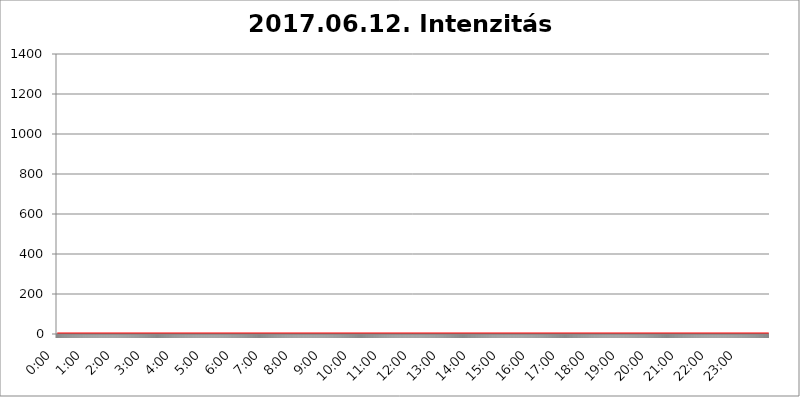
| Category | 2017.06.12. Intenzitás [W/m^2] |
|---|---|
| 0.0 | 0 |
| 0.0006944444444444445 | 0 |
| 0.001388888888888889 | 0 |
| 0.0020833333333333333 | 0 |
| 0.002777777777777778 | 0 |
| 0.003472222222222222 | 0 |
| 0.004166666666666667 | 0 |
| 0.004861111111111111 | 0 |
| 0.005555555555555556 | 0 |
| 0.0062499999999999995 | 0 |
| 0.006944444444444444 | 0 |
| 0.007638888888888889 | 0 |
| 0.008333333333333333 | 0 |
| 0.009027777777777779 | 0 |
| 0.009722222222222222 | 0 |
| 0.010416666666666666 | 0 |
| 0.011111111111111112 | 0 |
| 0.011805555555555555 | 0 |
| 0.012499999999999999 | 0 |
| 0.013194444444444444 | 0 |
| 0.013888888888888888 | 0 |
| 0.014583333333333332 | 0 |
| 0.015277777777777777 | 0 |
| 0.015972222222222224 | 0 |
| 0.016666666666666666 | 0 |
| 0.017361111111111112 | 0 |
| 0.018055555555555557 | 0 |
| 0.01875 | 0 |
| 0.019444444444444445 | 0 |
| 0.02013888888888889 | 0 |
| 0.020833333333333332 | 0 |
| 0.02152777777777778 | 0 |
| 0.022222222222222223 | 0 |
| 0.02291666666666667 | 0 |
| 0.02361111111111111 | 0 |
| 0.024305555555555556 | 0 |
| 0.024999999999999998 | 0 |
| 0.025694444444444447 | 0 |
| 0.02638888888888889 | 0 |
| 0.027083333333333334 | 0 |
| 0.027777777777777776 | 0 |
| 0.02847222222222222 | 0 |
| 0.029166666666666664 | 0 |
| 0.029861111111111113 | 0 |
| 0.030555555555555555 | 0 |
| 0.03125 | 0 |
| 0.03194444444444445 | 0 |
| 0.03263888888888889 | 0 |
| 0.03333333333333333 | 0 |
| 0.034027777777777775 | 0 |
| 0.034722222222222224 | 0 |
| 0.035416666666666666 | 0 |
| 0.036111111111111115 | 0 |
| 0.03680555555555556 | 0 |
| 0.0375 | 0 |
| 0.03819444444444444 | 0 |
| 0.03888888888888889 | 0 |
| 0.03958333333333333 | 0 |
| 0.04027777777777778 | 0 |
| 0.04097222222222222 | 0 |
| 0.041666666666666664 | 0 |
| 0.042361111111111106 | 0 |
| 0.04305555555555556 | 0 |
| 0.043750000000000004 | 0 |
| 0.044444444444444446 | 0 |
| 0.04513888888888889 | 0 |
| 0.04583333333333334 | 0 |
| 0.04652777777777778 | 0 |
| 0.04722222222222222 | 0 |
| 0.04791666666666666 | 0 |
| 0.04861111111111111 | 0 |
| 0.049305555555555554 | 0 |
| 0.049999999999999996 | 0 |
| 0.05069444444444445 | 0 |
| 0.051388888888888894 | 0 |
| 0.052083333333333336 | 0 |
| 0.05277777777777778 | 0 |
| 0.05347222222222222 | 0 |
| 0.05416666666666667 | 0 |
| 0.05486111111111111 | 0 |
| 0.05555555555555555 | 0 |
| 0.05625 | 0 |
| 0.05694444444444444 | 0 |
| 0.057638888888888885 | 0 |
| 0.05833333333333333 | 0 |
| 0.05902777777777778 | 0 |
| 0.059722222222222225 | 0 |
| 0.06041666666666667 | 0 |
| 0.061111111111111116 | 0 |
| 0.06180555555555556 | 0 |
| 0.0625 | 0 |
| 0.06319444444444444 | 0 |
| 0.06388888888888888 | 0 |
| 0.06458333333333334 | 0 |
| 0.06527777777777778 | 0 |
| 0.06597222222222222 | 0 |
| 0.06666666666666667 | 0 |
| 0.06736111111111111 | 0 |
| 0.06805555555555555 | 0 |
| 0.06874999999999999 | 0 |
| 0.06944444444444443 | 0 |
| 0.07013888888888889 | 0 |
| 0.07083333333333333 | 0 |
| 0.07152777777777779 | 0 |
| 0.07222222222222223 | 0 |
| 0.07291666666666667 | 0 |
| 0.07361111111111111 | 0 |
| 0.07430555555555556 | 0 |
| 0.075 | 0 |
| 0.07569444444444444 | 0 |
| 0.0763888888888889 | 0 |
| 0.07708333333333334 | 0 |
| 0.07777777777777778 | 0 |
| 0.07847222222222222 | 0 |
| 0.07916666666666666 | 0 |
| 0.0798611111111111 | 0 |
| 0.08055555555555556 | 0 |
| 0.08125 | 0 |
| 0.08194444444444444 | 0 |
| 0.08263888888888889 | 0 |
| 0.08333333333333333 | 0 |
| 0.08402777777777777 | 0 |
| 0.08472222222222221 | 0 |
| 0.08541666666666665 | 0 |
| 0.08611111111111112 | 0 |
| 0.08680555555555557 | 0 |
| 0.08750000000000001 | 0 |
| 0.08819444444444445 | 0 |
| 0.08888888888888889 | 0 |
| 0.08958333333333333 | 0 |
| 0.09027777777777778 | 0 |
| 0.09097222222222222 | 0 |
| 0.09166666666666667 | 0 |
| 0.09236111111111112 | 0 |
| 0.09305555555555556 | 0 |
| 0.09375 | 0 |
| 0.09444444444444444 | 0 |
| 0.09513888888888888 | 0 |
| 0.09583333333333333 | 0 |
| 0.09652777777777777 | 0 |
| 0.09722222222222222 | 0 |
| 0.09791666666666667 | 0 |
| 0.09861111111111111 | 0 |
| 0.09930555555555555 | 0 |
| 0.09999999999999999 | 0 |
| 0.10069444444444443 | 0 |
| 0.1013888888888889 | 0 |
| 0.10208333333333335 | 0 |
| 0.10277777777777779 | 0 |
| 0.10347222222222223 | 0 |
| 0.10416666666666667 | 0 |
| 0.10486111111111111 | 0 |
| 0.10555555555555556 | 0 |
| 0.10625 | 0 |
| 0.10694444444444444 | 0 |
| 0.1076388888888889 | 0 |
| 0.10833333333333334 | 0 |
| 0.10902777777777778 | 0 |
| 0.10972222222222222 | 0 |
| 0.1111111111111111 | 0 |
| 0.11180555555555556 | 0 |
| 0.11180555555555556 | 0 |
| 0.1125 | 0 |
| 0.11319444444444444 | 0 |
| 0.11388888888888889 | 0 |
| 0.11458333333333333 | 0 |
| 0.11527777777777777 | 0 |
| 0.11597222222222221 | 0 |
| 0.11666666666666665 | 0 |
| 0.1173611111111111 | 0 |
| 0.11805555555555557 | 0 |
| 0.11944444444444445 | 0 |
| 0.12013888888888889 | 0 |
| 0.12083333333333333 | 0 |
| 0.12152777777777778 | 0 |
| 0.12222222222222223 | 0 |
| 0.12291666666666667 | 0 |
| 0.12291666666666667 | 0 |
| 0.12361111111111112 | 0 |
| 0.12430555555555556 | 0 |
| 0.125 | 0 |
| 0.12569444444444444 | 0 |
| 0.12638888888888888 | 0 |
| 0.12708333333333333 | 0 |
| 0.16875 | 0 |
| 0.12847222222222224 | 0 |
| 0.12916666666666668 | 0 |
| 0.12986111111111112 | 0 |
| 0.13055555555555556 | 0 |
| 0.13125 | 0 |
| 0.13194444444444445 | 0 |
| 0.1326388888888889 | 0 |
| 0.13333333333333333 | 0 |
| 0.13402777777777777 | 0 |
| 0.13402777777777777 | 0 |
| 0.13472222222222222 | 0 |
| 0.13541666666666666 | 0 |
| 0.1361111111111111 | 0 |
| 0.13749999999999998 | 0 |
| 0.13819444444444443 | 0 |
| 0.1388888888888889 | 0 |
| 0.13958333333333334 | 0 |
| 0.14027777777777778 | 0 |
| 0.14097222222222222 | 0 |
| 0.14166666666666666 | 0 |
| 0.1423611111111111 | 0 |
| 0.14305555555555557 | 0 |
| 0.14375000000000002 | 0 |
| 0.14444444444444446 | 0 |
| 0.1451388888888889 | 0 |
| 0.1451388888888889 | 0 |
| 0.14652777777777778 | 0 |
| 0.14722222222222223 | 0 |
| 0.14791666666666667 | 0 |
| 0.1486111111111111 | 0 |
| 0.14930555555555555 | 0 |
| 0.15 | 0 |
| 0.15069444444444444 | 0 |
| 0.15138888888888888 | 0 |
| 0.15208333333333332 | 0 |
| 0.15277777777777776 | 0 |
| 0.15347222222222223 | 0 |
| 0.15416666666666667 | 0 |
| 0.15486111111111112 | 0 |
| 0.15555555555555556 | 0 |
| 0.15625 | 0 |
| 0.15694444444444444 | 0 |
| 0.15763888888888888 | 0 |
| 0.15833333333333333 | 0 |
| 0.15902777777777777 | 0 |
| 0.15972222222222224 | 0 |
| 0.16041666666666668 | 0 |
| 0.16111111111111112 | 0 |
| 0.16180555555555556 | 0 |
| 0.1625 | 0 |
| 0.16319444444444445 | 0 |
| 0.1638888888888889 | 0 |
| 0.16458333333333333 | 0 |
| 0.16527777777777777 | 0 |
| 0.16597222222222222 | 0 |
| 0.16666666666666666 | 0 |
| 0.1673611111111111 | 0 |
| 0.16805555555555554 | 0 |
| 0.16874999999999998 | 0 |
| 0.16944444444444443 | 0 |
| 0.17013888888888887 | 0 |
| 0.1708333333333333 | 0 |
| 0.17152777777777775 | 0 |
| 0.17222222222222225 | 0 |
| 0.1729166666666667 | 0 |
| 0.17361111111111113 | 0 |
| 0.17430555555555557 | 0 |
| 0.17500000000000002 | 0 |
| 0.17569444444444446 | 0 |
| 0.1763888888888889 | 0 |
| 0.17708333333333334 | 0 |
| 0.17777777777777778 | 0 |
| 0.17847222222222223 | 0 |
| 0.17916666666666667 | 0 |
| 0.1798611111111111 | 0 |
| 0.18055555555555555 | 0 |
| 0.18125 | 0 |
| 0.18194444444444444 | 0 |
| 0.1826388888888889 | 0 |
| 0.18333333333333335 | 0 |
| 0.1840277777777778 | 0 |
| 0.18472222222222223 | 0 |
| 0.18541666666666667 | 0 |
| 0.18611111111111112 | 0 |
| 0.18680555555555556 | 0 |
| 0.1875 | 0 |
| 0.18819444444444444 | 0 |
| 0.18888888888888888 | 0 |
| 0.18958333333333333 | 0 |
| 0.19027777777777777 | 0 |
| 0.1909722222222222 | 0 |
| 0.19166666666666665 | 0 |
| 0.19236111111111112 | 0 |
| 0.19305555555555554 | 0 |
| 0.19375 | 0 |
| 0.19444444444444445 | 0 |
| 0.1951388888888889 | 0 |
| 0.19583333333333333 | 0 |
| 0.19652777777777777 | 0 |
| 0.19722222222222222 | 0 |
| 0.19791666666666666 | 0 |
| 0.1986111111111111 | 0 |
| 0.19930555555555554 | 0 |
| 0.19999999999999998 | 0 |
| 0.20069444444444443 | 0 |
| 0.20138888888888887 | 0 |
| 0.2020833333333333 | 0 |
| 0.2027777777777778 | 0 |
| 0.2034722222222222 | 0 |
| 0.2041666666666667 | 0 |
| 0.20486111111111113 | 0 |
| 0.20555555555555557 | 0 |
| 0.20625000000000002 | 0 |
| 0.20694444444444446 | 0 |
| 0.2076388888888889 | 0 |
| 0.20833333333333334 | 0 |
| 0.20902777777777778 | 0 |
| 0.20972222222222223 | 0 |
| 0.21041666666666667 | 0 |
| 0.2111111111111111 | 0 |
| 0.21180555555555555 | 0 |
| 0.2125 | 0 |
| 0.21319444444444444 | 0 |
| 0.2138888888888889 | 0 |
| 0.21458333333333335 | 0 |
| 0.2152777777777778 | 0 |
| 0.21597222222222223 | 0 |
| 0.21666666666666667 | 0 |
| 0.21736111111111112 | 0 |
| 0.21805555555555556 | 0 |
| 0.21875 | 0 |
| 0.21944444444444444 | 0 |
| 0.22013888888888888 | 0 |
| 0.22083333333333333 | 0 |
| 0.22152777777777777 | 0 |
| 0.2222222222222222 | 0 |
| 0.22291666666666665 | 0 |
| 0.2236111111111111 | 0 |
| 0.22430555555555556 | 0 |
| 0.225 | 0 |
| 0.22569444444444445 | 0 |
| 0.2263888888888889 | 0 |
| 0.22708333333333333 | 0 |
| 0.22777777777777777 | 0 |
| 0.22847222222222222 | 0 |
| 0.22916666666666666 | 0 |
| 0.2298611111111111 | 0 |
| 0.23055555555555554 | 0 |
| 0.23124999999999998 | 0 |
| 0.23194444444444443 | 0 |
| 0.23263888888888887 | 0 |
| 0.2333333333333333 | 0 |
| 0.2340277777777778 | 0 |
| 0.2347222222222222 | 0 |
| 0.2354166666666667 | 0 |
| 0.23611111111111113 | 0 |
| 0.23680555555555557 | 0 |
| 0.23750000000000002 | 0 |
| 0.23819444444444446 | 0 |
| 0.2388888888888889 | 0 |
| 0.23958333333333334 | 0 |
| 0.24027777777777778 | 0 |
| 0.24097222222222223 | 0 |
| 0.24166666666666667 | 0 |
| 0.2423611111111111 | 0 |
| 0.24305555555555555 | 0 |
| 0.24375 | 0 |
| 0.24444444444444446 | 0 |
| 0.24513888888888888 | 0 |
| 0.24583333333333335 | 0 |
| 0.2465277777777778 | 0 |
| 0.24722222222222223 | 0 |
| 0.24791666666666667 | 0 |
| 0.24861111111111112 | 0 |
| 0.24930555555555556 | 0 |
| 0.25 | 0 |
| 0.25069444444444444 | 0 |
| 0.2513888888888889 | 0 |
| 0.2520833333333333 | 0 |
| 0.25277777777777777 | 0 |
| 0.2534722222222222 | 0 |
| 0.25416666666666665 | 0 |
| 0.2548611111111111 | 0 |
| 0.2555555555555556 | 0 |
| 0.25625000000000003 | 0 |
| 0.2569444444444445 | 0 |
| 0.2576388888888889 | 0 |
| 0.25833333333333336 | 0 |
| 0.2590277777777778 | 0 |
| 0.25972222222222224 | 0 |
| 0.2604166666666667 | 0 |
| 0.2611111111111111 | 0 |
| 0.26180555555555557 | 0 |
| 0.2625 | 0 |
| 0.26319444444444445 | 0 |
| 0.2638888888888889 | 0 |
| 0.26458333333333334 | 0 |
| 0.2652777777777778 | 0 |
| 0.2659722222222222 | 0 |
| 0.26666666666666666 | 0 |
| 0.2673611111111111 | 0 |
| 0.26805555555555555 | 0 |
| 0.26875 | 0 |
| 0.26944444444444443 | 0 |
| 0.2701388888888889 | 0 |
| 0.2708333333333333 | 0 |
| 0.27152777777777776 | 0 |
| 0.2722222222222222 | 0 |
| 0.27291666666666664 | 0 |
| 0.2736111111111111 | 0 |
| 0.2743055555555555 | 0 |
| 0.27499999999999997 | 0 |
| 0.27569444444444446 | 0 |
| 0.27638888888888885 | 0 |
| 0.27708333333333335 | 0 |
| 0.2777777777777778 | 0 |
| 0.27847222222222223 | 0 |
| 0.2791666666666667 | 0 |
| 0.2798611111111111 | 0 |
| 0.28055555555555556 | 0 |
| 0.28125 | 0 |
| 0.28194444444444444 | 0 |
| 0.2826388888888889 | 0 |
| 0.2833333333333333 | 0 |
| 0.28402777777777777 | 0 |
| 0.2847222222222222 | 0 |
| 0.28541666666666665 | 0 |
| 0.28611111111111115 | 0 |
| 0.28680555555555554 | 0 |
| 0.28750000000000003 | 0 |
| 0.2881944444444445 | 0 |
| 0.2888888888888889 | 0 |
| 0.28958333333333336 | 0 |
| 0.2902777777777778 | 0 |
| 0.29097222222222224 | 0 |
| 0.2916666666666667 | 0 |
| 0.2923611111111111 | 0 |
| 0.29305555555555557 | 0 |
| 0.29375 | 0 |
| 0.29444444444444445 | 0 |
| 0.2951388888888889 | 0 |
| 0.29583333333333334 | 0 |
| 0.2965277777777778 | 0 |
| 0.2972222222222222 | 0 |
| 0.29791666666666666 | 0 |
| 0.2986111111111111 | 0 |
| 0.29930555555555555 | 0 |
| 0.3 | 0 |
| 0.30069444444444443 | 0 |
| 0.3013888888888889 | 0 |
| 0.3020833333333333 | 0 |
| 0.30277777777777776 | 0 |
| 0.3034722222222222 | 0 |
| 0.30416666666666664 | 0 |
| 0.3048611111111111 | 0 |
| 0.3055555555555555 | 0 |
| 0.30624999999999997 | 0 |
| 0.3069444444444444 | 0 |
| 0.3076388888888889 | 0 |
| 0.30833333333333335 | 0 |
| 0.3090277777777778 | 0 |
| 0.30972222222222223 | 0 |
| 0.3104166666666667 | 0 |
| 0.3111111111111111 | 0 |
| 0.31180555555555556 | 0 |
| 0.3125 | 0 |
| 0.31319444444444444 | 0 |
| 0.3138888888888889 | 0 |
| 0.3145833333333333 | 0 |
| 0.31527777777777777 | 0 |
| 0.3159722222222222 | 0 |
| 0.31666666666666665 | 0 |
| 0.31736111111111115 | 0 |
| 0.31805555555555554 | 0 |
| 0.31875000000000003 | 0 |
| 0.3194444444444445 | 0 |
| 0.3201388888888889 | 0 |
| 0.32083333333333336 | 0 |
| 0.3215277777777778 | 0 |
| 0.32222222222222224 | 0 |
| 0.3229166666666667 | 0 |
| 0.3236111111111111 | 0 |
| 0.32430555555555557 | 0 |
| 0.325 | 0 |
| 0.32569444444444445 | 0 |
| 0.3263888888888889 | 0 |
| 0.32708333333333334 | 0 |
| 0.3277777777777778 | 0 |
| 0.3284722222222222 | 0 |
| 0.32916666666666666 | 0 |
| 0.3298611111111111 | 0 |
| 0.33055555555555555 | 0 |
| 0.33125 | 0 |
| 0.33194444444444443 | 0 |
| 0.3326388888888889 | 0 |
| 0.3333333333333333 | 0 |
| 0.3340277777777778 | 0 |
| 0.3347222222222222 | 0 |
| 0.3354166666666667 | 0 |
| 0.3361111111111111 | 0 |
| 0.3368055555555556 | 0 |
| 0.33749999999999997 | 0 |
| 0.33819444444444446 | 0 |
| 0.33888888888888885 | 0 |
| 0.33958333333333335 | 0 |
| 0.34027777777777773 | 0 |
| 0.34097222222222223 | 0 |
| 0.3416666666666666 | 0 |
| 0.3423611111111111 | 0 |
| 0.3430555555555555 | 0 |
| 0.34375 | 0 |
| 0.3444444444444445 | 0 |
| 0.3451388888888889 | 0 |
| 0.3458333333333334 | 0 |
| 0.34652777777777777 | 0 |
| 0.34722222222222227 | 0 |
| 0.34791666666666665 | 0 |
| 0.34861111111111115 | 0 |
| 0.34930555555555554 | 0 |
| 0.35000000000000003 | 0 |
| 0.3506944444444444 | 0 |
| 0.3513888888888889 | 0 |
| 0.3520833333333333 | 0 |
| 0.3527777777777778 | 0 |
| 0.3534722222222222 | 0 |
| 0.3541666666666667 | 0 |
| 0.3548611111111111 | 0 |
| 0.35555555555555557 | 0 |
| 0.35625 | 0 |
| 0.35694444444444445 | 0 |
| 0.3576388888888889 | 0 |
| 0.35833333333333334 | 0 |
| 0.3590277777777778 | 0 |
| 0.3597222222222222 | 0 |
| 0.36041666666666666 | 0 |
| 0.3611111111111111 | 0 |
| 0.36180555555555555 | 0 |
| 0.3625 | 0 |
| 0.36319444444444443 | 0 |
| 0.3638888888888889 | 0 |
| 0.3645833333333333 | 0 |
| 0.3652777777777778 | 0 |
| 0.3659722222222222 | 0 |
| 0.3666666666666667 | 0 |
| 0.3673611111111111 | 0 |
| 0.3680555555555556 | 0 |
| 0.36874999999999997 | 0 |
| 0.36944444444444446 | 0 |
| 0.37013888888888885 | 0 |
| 0.37083333333333335 | 0 |
| 0.37152777777777773 | 0 |
| 0.37222222222222223 | 0 |
| 0.3729166666666666 | 0 |
| 0.3736111111111111 | 0 |
| 0.3743055555555555 | 0 |
| 0.375 | 0 |
| 0.3756944444444445 | 0 |
| 0.3763888888888889 | 0 |
| 0.3770833333333334 | 0 |
| 0.37777777777777777 | 0 |
| 0.37847222222222227 | 0 |
| 0.37916666666666665 | 0 |
| 0.37986111111111115 | 0 |
| 0.38055555555555554 | 0 |
| 0.38125000000000003 | 0 |
| 0.3819444444444444 | 0 |
| 0.3826388888888889 | 0 |
| 0.3833333333333333 | 0 |
| 0.3840277777777778 | 0 |
| 0.3847222222222222 | 0 |
| 0.3854166666666667 | 0 |
| 0.3861111111111111 | 0 |
| 0.38680555555555557 | 0 |
| 0.3875 | 0 |
| 0.38819444444444445 | 0 |
| 0.3888888888888889 | 0 |
| 0.38958333333333334 | 0 |
| 0.3902777777777778 | 0 |
| 0.3909722222222222 | 0 |
| 0.39166666666666666 | 0 |
| 0.3923611111111111 | 0 |
| 0.39305555555555555 | 0 |
| 0.39375 | 0 |
| 0.39444444444444443 | 0 |
| 0.3951388888888889 | 0 |
| 0.3958333333333333 | 0 |
| 0.3965277777777778 | 0 |
| 0.3972222222222222 | 0 |
| 0.3979166666666667 | 0 |
| 0.3986111111111111 | 0 |
| 0.3993055555555556 | 0 |
| 0.39999999999999997 | 0 |
| 0.40069444444444446 | 0 |
| 0.40138888888888885 | 0 |
| 0.40208333333333335 | 0 |
| 0.40277777777777773 | 0 |
| 0.40347222222222223 | 0 |
| 0.4041666666666666 | 0 |
| 0.4048611111111111 | 0 |
| 0.4055555555555555 | 0 |
| 0.40625 | 0 |
| 0.4069444444444445 | 0 |
| 0.4076388888888889 | 0 |
| 0.4083333333333334 | 0 |
| 0.40902777777777777 | 0 |
| 0.40972222222222227 | 0 |
| 0.41041666666666665 | 0 |
| 0.41111111111111115 | 0 |
| 0.41180555555555554 | 0 |
| 0.41250000000000003 | 0 |
| 0.4131944444444444 | 0 |
| 0.4138888888888889 | 0 |
| 0.4145833333333333 | 0 |
| 0.4152777777777778 | 0 |
| 0.4159722222222222 | 0 |
| 0.4166666666666667 | 0 |
| 0.4173611111111111 | 0 |
| 0.41805555555555557 | 0 |
| 0.41875 | 0 |
| 0.41944444444444445 | 0 |
| 0.4201388888888889 | 0 |
| 0.42083333333333334 | 0 |
| 0.4215277777777778 | 0 |
| 0.4222222222222222 | 0 |
| 0.42291666666666666 | 0 |
| 0.4236111111111111 | 0 |
| 0.42430555555555555 | 0 |
| 0.425 | 0 |
| 0.42569444444444443 | 0 |
| 0.4263888888888889 | 0 |
| 0.4270833333333333 | 0 |
| 0.4277777777777778 | 0 |
| 0.4284722222222222 | 0 |
| 0.4291666666666667 | 0 |
| 0.4298611111111111 | 0 |
| 0.4305555555555556 | 0 |
| 0.43124999999999997 | 0 |
| 0.43194444444444446 | 0 |
| 0.43263888888888885 | 0 |
| 0.43333333333333335 | 0 |
| 0.43402777777777773 | 0 |
| 0.43472222222222223 | 0 |
| 0.4354166666666666 | 0 |
| 0.4361111111111111 | 0 |
| 0.4368055555555555 | 0 |
| 0.4375 | 0 |
| 0.4381944444444445 | 0 |
| 0.4388888888888889 | 0 |
| 0.4395833333333334 | 0 |
| 0.44027777777777777 | 0 |
| 0.44097222222222227 | 0 |
| 0.44166666666666665 | 0 |
| 0.44236111111111115 | 0 |
| 0.44305555555555554 | 0 |
| 0.44375000000000003 | 0 |
| 0.4444444444444444 | 0 |
| 0.4451388888888889 | 0 |
| 0.4458333333333333 | 0 |
| 0.4465277777777778 | 0 |
| 0.4472222222222222 | 0 |
| 0.4479166666666667 | 0 |
| 0.4486111111111111 | 0 |
| 0.44930555555555557 | 0 |
| 0.45 | 0 |
| 0.45069444444444445 | 0 |
| 0.4513888888888889 | 0 |
| 0.45208333333333334 | 0 |
| 0.4527777777777778 | 0 |
| 0.4534722222222222 | 0 |
| 0.45416666666666666 | 0 |
| 0.4548611111111111 | 0 |
| 0.45555555555555555 | 0 |
| 0.45625 | 0 |
| 0.45694444444444443 | 0 |
| 0.4576388888888889 | 0 |
| 0.4583333333333333 | 0 |
| 0.4590277777777778 | 0 |
| 0.4597222222222222 | 0 |
| 0.4604166666666667 | 0 |
| 0.4611111111111111 | 0 |
| 0.4618055555555556 | 0 |
| 0.46249999999999997 | 0 |
| 0.46319444444444446 | 0 |
| 0.46388888888888885 | 0 |
| 0.46458333333333335 | 0 |
| 0.46527777777777773 | 0 |
| 0.46597222222222223 | 0 |
| 0.4666666666666666 | 0 |
| 0.4673611111111111 | 0 |
| 0.4680555555555555 | 0 |
| 0.46875 | 0 |
| 0.4694444444444445 | 0 |
| 0.4701388888888889 | 0 |
| 0.4708333333333334 | 0 |
| 0.47152777777777777 | 0 |
| 0.47222222222222227 | 0 |
| 0.47291666666666665 | 0 |
| 0.47361111111111115 | 0 |
| 0.47430555555555554 | 0 |
| 0.47500000000000003 | 0 |
| 0.4756944444444444 | 0 |
| 0.4763888888888889 | 0 |
| 0.4770833333333333 | 0 |
| 0.4777777777777778 | 0 |
| 0.4784722222222222 | 0 |
| 0.4791666666666667 | 0 |
| 0.4798611111111111 | 0 |
| 0.48055555555555557 | 0 |
| 0.48125 | 0 |
| 0.48194444444444445 | 0 |
| 0.4826388888888889 | 0 |
| 0.48333333333333334 | 0 |
| 0.4840277777777778 | 0 |
| 0.4847222222222222 | 0 |
| 0.48541666666666666 | 0 |
| 0.4861111111111111 | 0 |
| 0.48680555555555555 | 0 |
| 0.4875 | 0 |
| 0.48819444444444443 | 0 |
| 0.4888888888888889 | 0 |
| 0.4895833333333333 | 0 |
| 0.4902777777777778 | 0 |
| 0.4909722222222222 | 0 |
| 0.4916666666666667 | 0 |
| 0.4923611111111111 | 0 |
| 0.4930555555555556 | 0 |
| 0.49374999999999997 | 0 |
| 0.49444444444444446 | 0 |
| 0.49513888888888885 | 0 |
| 0.49583333333333335 | 0 |
| 0.49652777777777773 | 0 |
| 0.49722222222222223 | 0 |
| 0.4979166666666666 | 0 |
| 0.4986111111111111 | 0 |
| 0.4993055555555555 | 0 |
| 0.5 | 0 |
| 0.5006944444444444 | 0 |
| 0.5013888888888889 | 0 |
| 0.5020833333333333 | 0 |
| 0.5027777777777778 | 0 |
| 0.5034722222222222 | 0 |
| 0.5041666666666667 | 0 |
| 0.5048611111111111 | 0 |
| 0.5055555555555555 | 0 |
| 0.50625 | 0 |
| 0.5069444444444444 | 0 |
| 0.5076388888888889 | 0 |
| 0.5083333333333333 | 0 |
| 0.5090277777777777 | 0 |
| 0.5097222222222222 | 0 |
| 0.5104166666666666 | 0 |
| 0.5111111111111112 | 0 |
| 0.5118055555555555 | 0 |
| 0.5125000000000001 | 0 |
| 0.5131944444444444 | 0 |
| 0.513888888888889 | 0 |
| 0.5145833333333333 | 0 |
| 0.5152777777777778 | 0 |
| 0.5159722222222222 | 0 |
| 0.5166666666666667 | 0 |
| 0.517361111111111 | 0 |
| 0.5180555555555556 | 0 |
| 0.5187499999999999 | 0 |
| 0.5194444444444445 | 0 |
| 0.5201388888888888 | 0 |
| 0.5208333333333334 | 0 |
| 0.5215277777777778 | 0 |
| 0.5222222222222223 | 0 |
| 0.5229166666666667 | 0 |
| 0.5236111111111111 | 0 |
| 0.5243055555555556 | 0 |
| 0.525 | 0 |
| 0.5256944444444445 | 0 |
| 0.5263888888888889 | 0 |
| 0.5270833333333333 | 0 |
| 0.5277777777777778 | 0 |
| 0.5284722222222222 | 0 |
| 0.5291666666666667 | 0 |
| 0.5298611111111111 | 0 |
| 0.5305555555555556 | 0 |
| 0.53125 | 0 |
| 0.5319444444444444 | 0 |
| 0.5326388888888889 | 0 |
| 0.5333333333333333 | 0 |
| 0.5340277777777778 | 0 |
| 0.5347222222222222 | 0 |
| 0.5354166666666667 | 0 |
| 0.5361111111111111 | 0 |
| 0.5368055555555555 | 0 |
| 0.5375 | 0 |
| 0.5381944444444444 | 0 |
| 0.5388888888888889 | 0 |
| 0.5395833333333333 | 0 |
| 0.5402777777777777 | 0 |
| 0.5409722222222222 | 0 |
| 0.5416666666666666 | 0 |
| 0.5423611111111112 | 0 |
| 0.5430555555555555 | 0 |
| 0.5437500000000001 | 0 |
| 0.5444444444444444 | 0 |
| 0.545138888888889 | 0 |
| 0.5458333333333333 | 0 |
| 0.5465277777777778 | 0 |
| 0.5472222222222222 | 0 |
| 0.5479166666666667 | 0 |
| 0.548611111111111 | 0 |
| 0.5493055555555556 | 0 |
| 0.5499999999999999 | 0 |
| 0.5506944444444445 | 0 |
| 0.5513888888888888 | 0 |
| 0.5520833333333334 | 0 |
| 0.5527777777777778 | 0 |
| 0.5534722222222223 | 0 |
| 0.5541666666666667 | 0 |
| 0.5548611111111111 | 0 |
| 0.5555555555555556 | 0 |
| 0.55625 | 0 |
| 0.5569444444444445 | 0 |
| 0.5576388888888889 | 0 |
| 0.5583333333333333 | 0 |
| 0.5590277777777778 | 0 |
| 0.5597222222222222 | 0 |
| 0.5604166666666667 | 0 |
| 0.5611111111111111 | 0 |
| 0.5618055555555556 | 0 |
| 0.5625 | 0 |
| 0.5631944444444444 | 0 |
| 0.5638888888888889 | 0 |
| 0.5645833333333333 | 0 |
| 0.5652777777777778 | 0 |
| 0.5659722222222222 | 0 |
| 0.5666666666666667 | 0 |
| 0.5673611111111111 | 0 |
| 0.5680555555555555 | 0 |
| 0.56875 | 0 |
| 0.5694444444444444 | 0 |
| 0.5701388888888889 | 0 |
| 0.5708333333333333 | 0 |
| 0.5715277777777777 | 0 |
| 0.5722222222222222 | 0 |
| 0.5729166666666666 | 0 |
| 0.5736111111111112 | 0 |
| 0.5743055555555555 | 0 |
| 0.5750000000000001 | 0 |
| 0.5756944444444444 | 0 |
| 0.576388888888889 | 0 |
| 0.5770833333333333 | 0 |
| 0.5777777777777778 | 0 |
| 0.5784722222222222 | 0 |
| 0.5791666666666667 | 0 |
| 0.579861111111111 | 0 |
| 0.5805555555555556 | 0 |
| 0.5812499999999999 | 0 |
| 0.5819444444444445 | 0 |
| 0.5826388888888888 | 0 |
| 0.5833333333333334 | 0 |
| 0.5840277777777778 | 0 |
| 0.5847222222222223 | 0 |
| 0.5854166666666667 | 0 |
| 0.5861111111111111 | 0 |
| 0.5868055555555556 | 0 |
| 0.5875 | 0 |
| 0.5881944444444445 | 0 |
| 0.5888888888888889 | 0 |
| 0.5895833333333333 | 0 |
| 0.5902777777777778 | 0 |
| 0.5909722222222222 | 0 |
| 0.5916666666666667 | 0 |
| 0.5923611111111111 | 0 |
| 0.5930555555555556 | 0 |
| 0.59375 | 0 |
| 0.5944444444444444 | 0 |
| 0.5951388888888889 | 0 |
| 0.5958333333333333 | 0 |
| 0.5965277777777778 | 0 |
| 0.5972222222222222 | 0 |
| 0.5979166666666667 | 0 |
| 0.5986111111111111 | 0 |
| 0.5993055555555555 | 0 |
| 0.6 | 0 |
| 0.6006944444444444 | 0 |
| 0.6013888888888889 | 0 |
| 0.6020833333333333 | 0 |
| 0.6027777777777777 | 0 |
| 0.6034722222222222 | 0 |
| 0.6041666666666666 | 0 |
| 0.6048611111111112 | 0 |
| 0.6055555555555555 | 0 |
| 0.6062500000000001 | 0 |
| 0.6069444444444444 | 0 |
| 0.607638888888889 | 0 |
| 0.6083333333333333 | 0 |
| 0.6090277777777778 | 0 |
| 0.6097222222222222 | 0 |
| 0.6104166666666667 | 0 |
| 0.611111111111111 | 0 |
| 0.6118055555555556 | 0 |
| 0.6124999999999999 | 0 |
| 0.6131944444444445 | 0 |
| 0.6138888888888888 | 0 |
| 0.6145833333333334 | 0 |
| 0.6152777777777778 | 0 |
| 0.6159722222222223 | 0 |
| 0.6166666666666667 | 0 |
| 0.6173611111111111 | 0 |
| 0.6180555555555556 | 0 |
| 0.61875 | 0 |
| 0.6194444444444445 | 0 |
| 0.6201388888888889 | 0 |
| 0.6208333333333333 | 0 |
| 0.6215277777777778 | 0 |
| 0.6222222222222222 | 0 |
| 0.6229166666666667 | 0 |
| 0.6236111111111111 | 0 |
| 0.6243055555555556 | 0 |
| 0.625 | 0 |
| 0.6256944444444444 | 0 |
| 0.6263888888888889 | 0 |
| 0.6270833333333333 | 0 |
| 0.6277777777777778 | 0 |
| 0.6284722222222222 | 0 |
| 0.6291666666666667 | 0 |
| 0.6298611111111111 | 0 |
| 0.6305555555555555 | 0 |
| 0.63125 | 0 |
| 0.6319444444444444 | 0 |
| 0.6326388888888889 | 0 |
| 0.6333333333333333 | 0 |
| 0.6340277777777777 | 0 |
| 0.6347222222222222 | 0 |
| 0.6354166666666666 | 0 |
| 0.6361111111111112 | 0 |
| 0.6368055555555555 | 0 |
| 0.6375000000000001 | 0 |
| 0.6381944444444444 | 0 |
| 0.638888888888889 | 0 |
| 0.6395833333333333 | 0 |
| 0.6402777777777778 | 0 |
| 0.6409722222222222 | 0 |
| 0.6416666666666667 | 0 |
| 0.642361111111111 | 0 |
| 0.6430555555555556 | 0 |
| 0.6437499999999999 | 0 |
| 0.6444444444444445 | 0 |
| 0.6451388888888888 | 0 |
| 0.6458333333333334 | 0 |
| 0.6465277777777778 | 0 |
| 0.6472222222222223 | 0 |
| 0.6479166666666667 | 0 |
| 0.6486111111111111 | 0 |
| 0.6493055555555556 | 0 |
| 0.65 | 0 |
| 0.6506944444444445 | 0 |
| 0.6513888888888889 | 0 |
| 0.6520833333333333 | 0 |
| 0.6527777777777778 | 0 |
| 0.6534722222222222 | 0 |
| 0.6541666666666667 | 0 |
| 0.6548611111111111 | 0 |
| 0.6555555555555556 | 0 |
| 0.65625 | 0 |
| 0.6569444444444444 | 0 |
| 0.6576388888888889 | 0 |
| 0.6583333333333333 | 0 |
| 0.6590277777777778 | 0 |
| 0.6597222222222222 | 0 |
| 0.6604166666666667 | 0 |
| 0.6611111111111111 | 0 |
| 0.6618055555555555 | 0 |
| 0.6625 | 0 |
| 0.6631944444444444 | 0 |
| 0.6638888888888889 | 0 |
| 0.6645833333333333 | 0 |
| 0.6652777777777777 | 0 |
| 0.6659722222222222 | 0 |
| 0.6666666666666666 | 0 |
| 0.6673611111111111 | 0 |
| 0.6680555555555556 | 0 |
| 0.6687500000000001 | 0 |
| 0.6694444444444444 | 0 |
| 0.6701388888888888 | 0 |
| 0.6708333333333334 | 0 |
| 0.6715277777777778 | 0 |
| 0.6722222222222222 | 0 |
| 0.6729166666666666 | 0 |
| 0.6736111111111112 | 0 |
| 0.6743055555555556 | 0 |
| 0.6749999999999999 | 0 |
| 0.6756944444444444 | 0 |
| 0.6763888888888889 | 0 |
| 0.6770833333333334 | 0 |
| 0.6777777777777777 | 0 |
| 0.6784722222222223 | 0 |
| 0.6791666666666667 | 0 |
| 0.6798611111111111 | 0 |
| 0.6805555555555555 | 0 |
| 0.68125 | 0 |
| 0.6819444444444445 | 0 |
| 0.6826388888888889 | 0 |
| 0.6833333333333332 | 0 |
| 0.6840277777777778 | 0 |
| 0.6847222222222222 | 0 |
| 0.6854166666666667 | 0 |
| 0.686111111111111 | 0 |
| 0.6868055555555556 | 0 |
| 0.6875 | 0 |
| 0.6881944444444444 | 0 |
| 0.688888888888889 | 0 |
| 0.6895833333333333 | 0 |
| 0.6902777777777778 | 0 |
| 0.6909722222222222 | 0 |
| 0.6916666666666668 | 0 |
| 0.6923611111111111 | 0 |
| 0.6930555555555555 | 0 |
| 0.69375 | 0 |
| 0.6944444444444445 | 0 |
| 0.6951388888888889 | 0 |
| 0.6958333333333333 | 0 |
| 0.6965277777777777 | 0 |
| 0.6972222222222223 | 0 |
| 0.6979166666666666 | 0 |
| 0.6986111111111111 | 0 |
| 0.6993055555555556 | 0 |
| 0.7000000000000001 | 0 |
| 0.7006944444444444 | 0 |
| 0.7013888888888888 | 0 |
| 0.7020833333333334 | 0 |
| 0.7027777777777778 | 0 |
| 0.7034722222222222 | 0 |
| 0.7041666666666666 | 0 |
| 0.7048611111111112 | 0 |
| 0.7055555555555556 | 0 |
| 0.7062499999999999 | 0 |
| 0.7069444444444444 | 0 |
| 0.7076388888888889 | 0 |
| 0.7083333333333334 | 0 |
| 0.7090277777777777 | 0 |
| 0.7097222222222223 | 0 |
| 0.7104166666666667 | 0 |
| 0.7111111111111111 | 0 |
| 0.7118055555555555 | 0 |
| 0.7125 | 0 |
| 0.7131944444444445 | 0 |
| 0.7138888888888889 | 0 |
| 0.7145833333333332 | 0 |
| 0.7152777777777778 | 0 |
| 0.7159722222222222 | 0 |
| 0.7166666666666667 | 0 |
| 0.717361111111111 | 0 |
| 0.7180555555555556 | 0 |
| 0.71875 | 0 |
| 0.7194444444444444 | 0 |
| 0.720138888888889 | 0 |
| 0.7208333333333333 | 0 |
| 0.7215277777777778 | 0 |
| 0.7222222222222222 | 0 |
| 0.7229166666666668 | 0 |
| 0.7236111111111111 | 0 |
| 0.7243055555555555 | 0 |
| 0.725 | 0 |
| 0.7256944444444445 | 0 |
| 0.7263888888888889 | 0 |
| 0.7270833333333333 | 0 |
| 0.7277777777777777 | 0 |
| 0.7284722222222223 | 0 |
| 0.7291666666666666 | 0 |
| 0.7298611111111111 | 0 |
| 0.7305555555555556 | 0 |
| 0.7312500000000001 | 0 |
| 0.7319444444444444 | 0 |
| 0.7326388888888888 | 0 |
| 0.7333333333333334 | 0 |
| 0.7340277777777778 | 0 |
| 0.7347222222222222 | 0 |
| 0.7354166666666666 | 0 |
| 0.7361111111111112 | 0 |
| 0.7368055555555556 | 0 |
| 0.7374999999999999 | 0 |
| 0.7381944444444444 | 0 |
| 0.7388888888888889 | 0 |
| 0.7395833333333334 | 0 |
| 0.7402777777777777 | 0 |
| 0.7409722222222223 | 0 |
| 0.7416666666666667 | 0 |
| 0.7423611111111111 | 0 |
| 0.7430555555555555 | 0 |
| 0.74375 | 0 |
| 0.7444444444444445 | 0 |
| 0.7451388888888889 | 0 |
| 0.7458333333333332 | 0 |
| 0.7465277777777778 | 0 |
| 0.7472222222222222 | 0 |
| 0.7479166666666667 | 0 |
| 0.748611111111111 | 0 |
| 0.7493055555555556 | 0 |
| 0.75 | 0 |
| 0.7506944444444444 | 0 |
| 0.751388888888889 | 0 |
| 0.7520833333333333 | 0 |
| 0.7527777777777778 | 0 |
| 0.7534722222222222 | 0 |
| 0.7541666666666668 | 0 |
| 0.7548611111111111 | 0 |
| 0.7555555555555555 | 0 |
| 0.75625 | 0 |
| 0.7569444444444445 | 0 |
| 0.7576388888888889 | 0 |
| 0.7583333333333333 | 0 |
| 0.7590277777777777 | 0 |
| 0.7597222222222223 | 0 |
| 0.7604166666666666 | 0 |
| 0.7611111111111111 | 0 |
| 0.7618055555555556 | 0 |
| 0.7625000000000001 | 0 |
| 0.7631944444444444 | 0 |
| 0.7638888888888888 | 0 |
| 0.7645833333333334 | 0 |
| 0.7652777777777778 | 0 |
| 0.7659722222222222 | 0 |
| 0.7666666666666666 | 0 |
| 0.7673611111111112 | 0 |
| 0.7680555555555556 | 0 |
| 0.7687499999999999 | 0 |
| 0.7694444444444444 | 0 |
| 0.7701388888888889 | 0 |
| 0.7708333333333334 | 0 |
| 0.7715277777777777 | 0 |
| 0.7722222222222223 | 0 |
| 0.7729166666666667 | 0 |
| 0.7736111111111111 | 0 |
| 0.7743055555555555 | 0 |
| 0.775 | 0 |
| 0.7756944444444445 | 0 |
| 0.7763888888888889 | 0 |
| 0.7770833333333332 | 0 |
| 0.7777777777777778 | 0 |
| 0.7784722222222222 | 0 |
| 0.7791666666666667 | 0 |
| 0.779861111111111 | 0 |
| 0.7805555555555556 | 0 |
| 0.78125 | 0 |
| 0.7819444444444444 | 0 |
| 0.782638888888889 | 0 |
| 0.7833333333333333 | 0 |
| 0.7840277777777778 | 0 |
| 0.7847222222222222 | 0 |
| 0.7854166666666668 | 0 |
| 0.7861111111111111 | 0 |
| 0.7868055555555555 | 0 |
| 0.7875 | 0 |
| 0.7881944444444445 | 0 |
| 0.7888888888888889 | 0 |
| 0.7895833333333333 | 0 |
| 0.7902777777777777 | 0 |
| 0.7909722222222223 | 0 |
| 0.7916666666666666 | 0 |
| 0.7923611111111111 | 0 |
| 0.7930555555555556 | 0 |
| 0.7937500000000001 | 0 |
| 0.7944444444444444 | 0 |
| 0.7951388888888888 | 0 |
| 0.7958333333333334 | 0 |
| 0.7965277777777778 | 0 |
| 0.7972222222222222 | 0 |
| 0.7979166666666666 | 0 |
| 0.7986111111111112 | 0 |
| 0.7993055555555556 | 0 |
| 0.7999999999999999 | 0 |
| 0.8006944444444444 | 0 |
| 0.8013888888888889 | 0 |
| 0.8020833333333334 | 0 |
| 0.8027777777777777 | 0 |
| 0.8034722222222223 | 0 |
| 0.8041666666666667 | 0 |
| 0.8048611111111111 | 0 |
| 0.8055555555555555 | 0 |
| 0.80625 | 0 |
| 0.8069444444444445 | 0 |
| 0.8076388888888889 | 0 |
| 0.8083333333333332 | 0 |
| 0.8090277777777778 | 0 |
| 0.8097222222222222 | 0 |
| 0.8104166666666667 | 0 |
| 0.811111111111111 | 0 |
| 0.8118055555555556 | 0 |
| 0.8125 | 0 |
| 0.8131944444444444 | 0 |
| 0.813888888888889 | 0 |
| 0.8145833333333333 | 0 |
| 0.8152777777777778 | 0 |
| 0.8159722222222222 | 0 |
| 0.8166666666666668 | 0 |
| 0.8173611111111111 | 0 |
| 0.8180555555555555 | 0 |
| 0.81875 | 0 |
| 0.8194444444444445 | 0 |
| 0.8201388888888889 | 0 |
| 0.8208333333333333 | 0 |
| 0.8215277777777777 | 0 |
| 0.8222222222222223 | 0 |
| 0.8229166666666666 | 0 |
| 0.8236111111111111 | 0 |
| 0.8243055555555556 | 0 |
| 0.8250000000000001 | 0 |
| 0.8256944444444444 | 0 |
| 0.8263888888888888 | 0 |
| 0.8270833333333334 | 0 |
| 0.8277777777777778 | 0 |
| 0.8284722222222222 | 0 |
| 0.8291666666666666 | 0 |
| 0.8298611111111112 | 0 |
| 0.8305555555555556 | 0 |
| 0.8312499999999999 | 0 |
| 0.8319444444444444 | 0 |
| 0.8326388888888889 | 0 |
| 0.8333333333333334 | 0 |
| 0.8340277777777777 | 0 |
| 0.8347222222222223 | 0 |
| 0.8354166666666667 | 0 |
| 0.8361111111111111 | 0 |
| 0.8368055555555555 | 0 |
| 0.8375 | 0 |
| 0.8381944444444445 | 0 |
| 0.8388888888888889 | 0 |
| 0.8395833333333332 | 0 |
| 0.8402777777777778 | 0 |
| 0.8409722222222222 | 0 |
| 0.8416666666666667 | 0 |
| 0.842361111111111 | 0 |
| 0.8430555555555556 | 0 |
| 0.84375 | 0 |
| 0.8444444444444444 | 0 |
| 0.845138888888889 | 0 |
| 0.8458333333333333 | 0 |
| 0.8465277777777778 | 0 |
| 0.8472222222222222 | 0 |
| 0.8479166666666668 | 0 |
| 0.8486111111111111 | 0 |
| 0.8493055555555555 | 0 |
| 0.85 | 0 |
| 0.8506944444444445 | 0 |
| 0.8513888888888889 | 0 |
| 0.8520833333333333 | 0 |
| 0.8527777777777777 | 0 |
| 0.8534722222222223 | 0 |
| 0.8541666666666666 | 0 |
| 0.8548611111111111 | 0 |
| 0.8555555555555556 | 0 |
| 0.8562500000000001 | 0 |
| 0.8569444444444444 | 0 |
| 0.8576388888888888 | 0 |
| 0.8583333333333334 | 0 |
| 0.8590277777777778 | 0 |
| 0.8597222222222222 | 0 |
| 0.8604166666666666 | 0 |
| 0.8611111111111112 | 0 |
| 0.8618055555555556 | 0 |
| 0.8624999999999999 | 0 |
| 0.8631944444444444 | 0 |
| 0.8638888888888889 | 0 |
| 0.8645833333333334 | 0 |
| 0.8652777777777777 | 0 |
| 0.8659722222222223 | 0 |
| 0.8666666666666667 | 0 |
| 0.8673611111111111 | 0 |
| 0.8680555555555555 | 0 |
| 0.86875 | 0 |
| 0.8694444444444445 | 0 |
| 0.8701388888888889 | 0 |
| 0.8708333333333332 | 0 |
| 0.8715277777777778 | 0 |
| 0.8722222222222222 | 0 |
| 0.8729166666666667 | 0 |
| 0.873611111111111 | 0 |
| 0.8743055555555556 | 0 |
| 0.875 | 0 |
| 0.8756944444444444 | 0 |
| 0.876388888888889 | 0 |
| 0.8770833333333333 | 0 |
| 0.8777777777777778 | 0 |
| 0.8784722222222222 | 0 |
| 0.8791666666666668 | 0 |
| 0.8798611111111111 | 0 |
| 0.8805555555555555 | 0 |
| 0.88125 | 0 |
| 0.8819444444444445 | 0 |
| 0.8826388888888889 | 0 |
| 0.8833333333333333 | 0 |
| 0.8840277777777777 | 0 |
| 0.8847222222222223 | 0 |
| 0.8854166666666666 | 0 |
| 0.8861111111111111 | 0 |
| 0.8868055555555556 | 0 |
| 0.8875000000000001 | 0 |
| 0.8881944444444444 | 0 |
| 0.8888888888888888 | 0 |
| 0.8895833333333334 | 0 |
| 0.8902777777777778 | 0 |
| 0.8909722222222222 | 0 |
| 0.8916666666666666 | 0 |
| 0.8923611111111112 | 0 |
| 0.8930555555555556 | 0 |
| 0.8937499999999999 | 0 |
| 0.8944444444444444 | 0 |
| 0.8951388888888889 | 0 |
| 0.8958333333333334 | 0 |
| 0.8965277777777777 | 0 |
| 0.8972222222222223 | 0 |
| 0.8979166666666667 | 0 |
| 0.8986111111111111 | 0 |
| 0.8993055555555555 | 0 |
| 0.9 | 0 |
| 0.9006944444444445 | 0 |
| 0.9013888888888889 | 0 |
| 0.9020833333333332 | 0 |
| 0.9027777777777778 | 0 |
| 0.9034722222222222 | 0 |
| 0.9041666666666667 | 0 |
| 0.904861111111111 | 0 |
| 0.9055555555555556 | 0 |
| 0.90625 | 0 |
| 0.9069444444444444 | 0 |
| 0.907638888888889 | 0 |
| 0.9083333333333333 | 0 |
| 0.9090277777777778 | 0 |
| 0.9097222222222222 | 0 |
| 0.9104166666666668 | 0 |
| 0.9111111111111111 | 0 |
| 0.9118055555555555 | 0 |
| 0.9125 | 0 |
| 0.9131944444444445 | 0 |
| 0.9138888888888889 | 0 |
| 0.9145833333333333 | 0 |
| 0.9152777777777777 | 0 |
| 0.9159722222222223 | 0 |
| 0.9166666666666666 | 0 |
| 0.9173611111111111 | 0 |
| 0.9180555555555556 | 0 |
| 0.9187500000000001 | 0 |
| 0.9194444444444444 | 0 |
| 0.9201388888888888 | 0 |
| 0.9208333333333334 | 0 |
| 0.9215277777777778 | 0 |
| 0.9222222222222222 | 0 |
| 0.9229166666666666 | 0 |
| 0.9236111111111112 | 0 |
| 0.9243055555555556 | 0 |
| 0.9249999999999999 | 0 |
| 0.9256944444444444 | 0 |
| 0.9263888888888889 | 0 |
| 0.9270833333333334 | 0 |
| 0.9277777777777777 | 0 |
| 0.9284722222222223 | 0 |
| 0.9291666666666667 | 0 |
| 0.9298611111111111 | 0 |
| 0.9305555555555555 | 0 |
| 0.93125 | 0 |
| 0.9319444444444445 | 0 |
| 0.9326388888888889 | 0 |
| 0.9333333333333332 | 0 |
| 0.9340277777777778 | 0 |
| 0.9347222222222222 | 0 |
| 0.9354166666666667 | 0 |
| 0.936111111111111 | 0 |
| 0.9368055555555556 | 0 |
| 0.9375 | 0 |
| 0.9381944444444444 | 0 |
| 0.938888888888889 | 0 |
| 0.9395833333333333 | 0 |
| 0.9402777777777778 | 0 |
| 0.9409722222222222 | 0 |
| 0.9416666666666668 | 0 |
| 0.9423611111111111 | 0 |
| 0.9430555555555555 | 0 |
| 0.94375 | 0 |
| 0.9444444444444445 | 0 |
| 0.9451388888888889 | 0 |
| 0.9458333333333333 | 0 |
| 0.9465277777777777 | 0 |
| 0.9472222222222223 | 0 |
| 0.9479166666666666 | 0 |
| 0.9486111111111111 | 0 |
| 0.9493055555555556 | 0 |
| 0.9500000000000001 | 0 |
| 0.9506944444444444 | 0 |
| 0.9513888888888888 | 0 |
| 0.9520833333333334 | 0 |
| 0.9527777777777778 | 0 |
| 0.9534722222222222 | 0 |
| 0.9541666666666666 | 0 |
| 0.9548611111111112 | 0 |
| 0.9555555555555556 | 0 |
| 0.9562499999999999 | 0 |
| 0.9569444444444444 | 0 |
| 0.9576388888888889 | 0 |
| 0.9583333333333334 | 0 |
| 0.9590277777777777 | 0 |
| 0.9597222222222223 | 0 |
| 0.9604166666666667 | 0 |
| 0.9611111111111111 | 0 |
| 0.9618055555555555 | 0 |
| 0.9625 | 0 |
| 0.9631944444444445 | 0 |
| 0.9638888888888889 | 0 |
| 0.9645833333333332 | 0 |
| 0.9652777777777778 | 0 |
| 0.9659722222222222 | 0 |
| 0.9666666666666667 | 0 |
| 0.967361111111111 | 0 |
| 0.9680555555555556 | 0 |
| 0.96875 | 0 |
| 0.9694444444444444 | 0 |
| 0.970138888888889 | 0 |
| 0.9708333333333333 | 0 |
| 0.9715277777777778 | 0 |
| 0.9722222222222222 | 0 |
| 0.9729166666666668 | 0 |
| 0.9736111111111111 | 0 |
| 0.9743055555555555 | 0 |
| 0.975 | 0 |
| 0.9756944444444445 | 0 |
| 0.9763888888888889 | 0 |
| 0.9770833333333333 | 0 |
| 0.9777777777777777 | 0 |
| 0.9784722222222223 | 0 |
| 0.9791666666666666 | 0 |
| 0.9798611111111111 | 0 |
| 0.9805555555555556 | 0 |
| 0.9812500000000001 | 0 |
| 0.9819444444444444 | 0 |
| 0.9826388888888888 | 0 |
| 0.9833333333333334 | 0 |
| 0.9840277777777778 | 0 |
| 0.9847222222222222 | 0 |
| 0.9854166666666666 | 0 |
| 0.9861111111111112 | 0 |
| 0.9868055555555556 | 0 |
| 0.9874999999999999 | 0 |
| 0.9881944444444444 | 0 |
| 0.9888888888888889 | 0 |
| 0.9895833333333334 | 0 |
| 0.9902777777777777 | 0 |
| 0.9909722222222223 | 0 |
| 0.9916666666666667 | 0 |
| 0.9923611111111111 | 0 |
| 0.9930555555555555 | 0 |
| 0.99375 | 0 |
| 0.9944444444444445 | 0 |
| 0.9951388888888889 | 0 |
| 0.9958333333333332 | 0 |
| 0.9965277777777778 | 0 |
| 0.9972222222222222 | 0 |
| 0.9979166666666667 | 0 |
| 0.998611111111111 | 0 |
| 0.9993055555555556 | 0 |